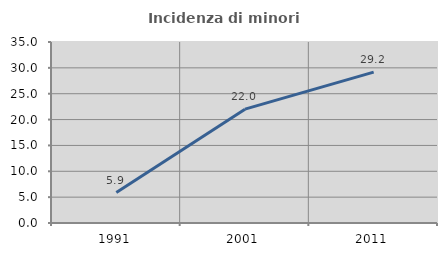
| Category | Incidenza di minori stranieri |
|---|---|
| 1991.0 | 5.882 |
| 2001.0 | 22.013 |
| 2011.0 | 29.167 |